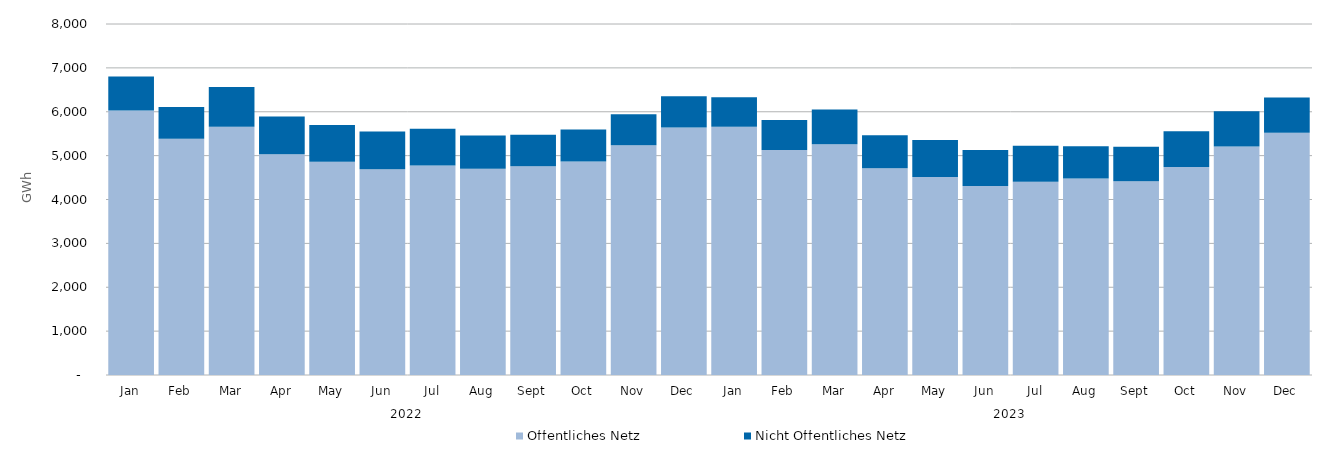
| Category | Öffentliches Netz | Nicht Öffentliches Netz |
|---|---|---|
| 0 | 6028.475 | 774.367 |
| 1 | 5386.247 | 720.913 |
| 2 | 5655.552 | 907.609 |
| 3 | 5033.529 | 856.921 |
| 4 | 4862.502 | 838.078 |
| 5 | 4692.124 | 858.234 |
| 6 | 4773.276 | 840.971 |
| 7 | 4698.667 | 762.243 |
| 8 | 4755.421 | 719.747 |
| 9 | 4864.398 | 730.946 |
| 10 | 5235.097 | 706.354 |
| 11 | 5641.206 | 713.769 |
| 12 | 5659.505 | 671.879 |
| 13 | 5126.775 | 687.829 |
| 14 | 5258.183 | 792.45 |
| 15 | 4711.087 | 754.737 |
| 16 | 4514.874 | 840.74 |
| 17 | 4310.301 | 816.57 |
| 18 | 4405.318 | 821.658 |
| 19 | 4480.215 | 733.939 |
| 20 | 4418.447 | 785.693 |
| 21 | 4742.512 | 812.366 |
| 22 | 5206.868 | 806.696 |
| 23 | 5521.46 | 803.595 |